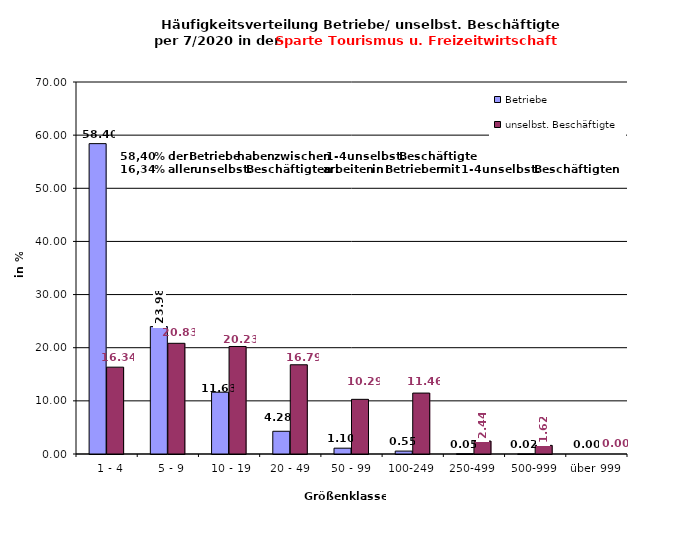
| Category | Betriebe | unselbst. Beschäftigte |
|---|---|---|
|   1 - 4 | 58.403 | 16.339 |
|   5 - 9 | 23.98 | 20.83 |
|  10 - 19 | 11.627 | 20.231 |
| 20 - 49 | 4.276 | 16.791 |
| 50 - 99 | 1.096 | 10.285 |
| 100-249 | 0.548 | 11.465 |
| 250-499 | 0.053 | 2.437 |
| 500-999 | 0.018 | 1.622 |
| über 999 | 0 | 0 |